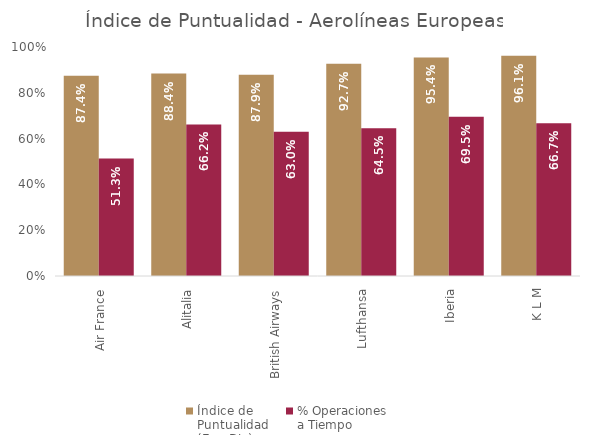
| Category | Índice de 
Puntualidad
(Ene-Dic) | % Operaciones 
a Tiempo |
|---|---|---|
| Air France | 0.874 | 0.513 |
| Alitalia | 0.884 | 0.662 |
| British Airways | 0.879 | 0.63 |
| Lufthansa | 0.927 | 0.645 |
| Iberia | 0.954 | 0.695 |
| K L M | 0.961 | 0.667 |